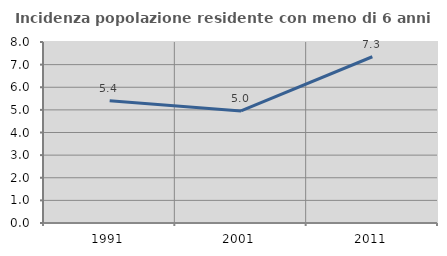
| Category | Incidenza popolazione residente con meno di 6 anni |
|---|---|
| 1991.0 | 5.4 |
| 2001.0 | 4.954 |
| 2011.0 | 7.348 |